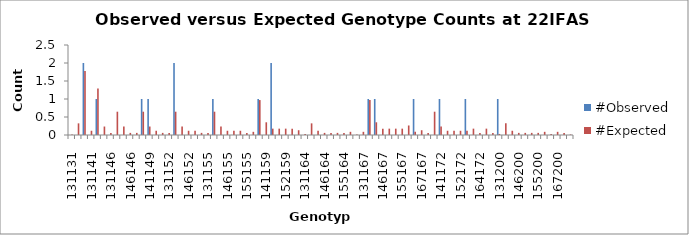
| Category | #Observed | #Expected |
|---|---|---|
| 131131.0 | 0 | 0.015 |
| 131137.0 | 0 | 0.324 |
| 137137.0 | 2 | 1.779 |
| 131141.0 | 0 | 0.118 |
| 137141.0 | 1 | 1.294 |
| 141141.0 | 0 | 0.235 |
| 131146.0 | 0 | 0.059 |
| 137146.0 | 0 | 0.647 |
| 141146.0 | 0 | 0.235 |
| 146146.0 | 0 | 0.059 |
| 131149.0 | 0 | 0.059 |
| 137149.0 | 1 | 0.647 |
| 141149.0 | 1 | 0.235 |
| 146149.0 | 0 | 0.118 |
| 149149.0 | 0 | 0.059 |
| 131152.0 | 0 | 0.059 |
| 137152.0 | 2 | 0.647 |
| 141152.0 | 0 | 0.235 |
| 146152.0 | 0 | 0.118 |
| 149152.0 | 0 | 0.118 |
| 152152.0 | 0 | 0.059 |
| 131155.0 | 0 | 0.059 |
| 137155.0 | 1 | 0.647 |
| 141155.0 | 0 | 0.235 |
| 146155.0 | 0 | 0.118 |
| 149155.0 | 0 | 0.118 |
| 152155.0 | 0 | 0.118 |
| 155155.0 | 0 | 0.059 |
| 131159.0 | 0 | 0.088 |
| 137159.0 | 1 | 0.971 |
| 141159.0 | 0 | 0.353 |
| 146159.0 | 2 | 0.176 |
| 149159.0 | 0 | 0.176 |
| 152159.0 | 0 | 0.176 |
| 155159.0 | 0 | 0.176 |
| 159159.0 | 0 | 0.132 |
| 131164.0 | 0 | 0.029 |
| 137164.0 | 0 | 0.324 |
| 141164.0 | 0 | 0.118 |
| 146164.0 | 0 | 0.059 |
| 149164.0 | 0 | 0.059 |
| 152164.0 | 0 | 0.059 |
| 155164.0 | 0 | 0.059 |
| 159164.0 | 0 | 0.088 |
| 164164.0 | 0 | 0.015 |
| 131167.0 | 0 | 0.088 |
| 137167.0 | 1 | 0.971 |
| 141167.0 | 1 | 0.353 |
| 146167.0 | 0 | 0.176 |
| 149167.0 | 0 | 0.176 |
| 152167.0 | 0 | 0.176 |
| 155167.0 | 0 | 0.176 |
| 159167.0 | 0 | 0.265 |
| 164167.0 | 1 | 0.088 |
| 167167.0 | 0 | 0.132 |
| 131172.0 | 0 | 0.059 |
| 137172.0 | 0 | 0.647 |
| 141172.0 | 1 | 0.235 |
| 146172.0 | 0 | 0.118 |
| 149172.0 | 0 | 0.118 |
| 152172.0 | 0 | 0.118 |
| 155172.0 | 1 | 0.118 |
| 159172.0 | 0 | 0.176 |
| 164172.0 | 0 | 0.059 |
| 167172.0 | 0 | 0.176 |
| 172172.0 | 0 | 0.059 |
| 131200.0 | 1 | 0.029 |
| 137200.0 | 0 | 0.324 |
| 141200.0 | 0 | 0.118 |
| 146200.0 | 0 | 0.059 |
| 149200.0 | 0 | 0.059 |
| 152200.0 | 0 | 0.059 |
| 155200.0 | 0 | 0.059 |
| 159200.0 | 0 | 0.088 |
| 164200.0 | 0 | 0.029 |
| 167200.0 | 0 | 0.088 |
| 172200.0 | 0 | 0.059 |
| 200200.0 | 0 | 0.015 |